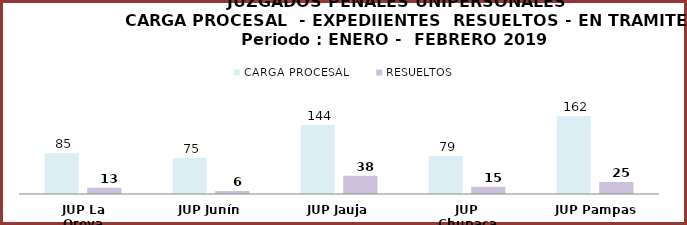
| Category | CARGA PROCESAL | RESUELTOS |
|---|---|---|
| JUP La Oroya | 85 | 13 |
| JUP Junín | 75 | 6 |
| JUP Jauja | 144 | 38 |
| JUP Chupaca | 79 | 15 |
| JUP Pampas | 162 | 25 |